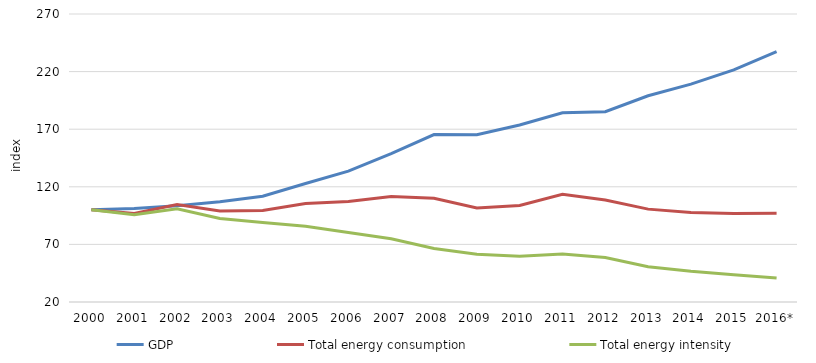
| Category | GDP | Total energy consumption | Total energy intensity |
|---|---|---|---|
| 2000 | 100 | 100 | 100 |
| 2001 | 101.172 | 96.833 | 95.711 |
| 2002 | 103.565 | 104.589 | 100.988 |
| 2003 | 107.106 | 99.1 | 92.525 |
| 2004 | 111.795 | 99.407 | 88.919 |
| 2005 | 122.882 | 105.434 | 85.801 |
| 2006 | 133.626 | 107.263 | 80.271 |
| 2007 | 148.84 | 111.549 | 74.946 |
| 2008 | 165.372 | 109.998 | 66.515 |
| 2009 | 165.25 | 101.635 | 61.504 |
| 2010 | 173.602 | 103.79 | 59.786 |
| 2011 | 184.225 | 113.555 | 61.639 |
| 2012 | 185.226 | 108.478 | 58.565 |
| 2013 | 199.023 | 100.612 | 50.553 |
| 2014 | 209.084 | 97.669 | 46.713 |
| 2015 | 221.55 | 96.861 | 43.72 |
| 2016* | 237.433 | 97.115 | 40.902 |